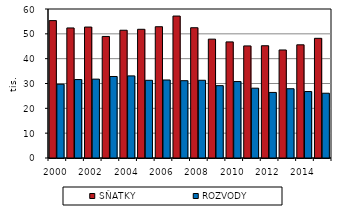
| Category | SŇATKY | ROZVODY |
|---|---|---|
| 2000.0 | 55321 | 29704 |
| 2001.0 | 52374 | 31586 |
| 2002.0 | 52732 | 31758 |
| 2003.0 | 48943 | 32824 |
| 2004.0 | 51447 | 33060 |
| 2005.0 | 51829 | 31288 |
| 2006.0 | 52860 | 31415 |
| 2007.0 | 57157 | 31129 |
| 2008.0 | 52457 | 31300 |
| 2009.0 | 47862 | 29133 |
| 2010.0 | 46746 | 30783 |
| 2011.0 | 45137 | 28113 |
| 2012.0 | 45206 | 26402 |
| 2013.0 | 43499 | 27895 |
| 2014.0 | 45575 | 26764 |
| 2015.0 | 48191 | 26083 |